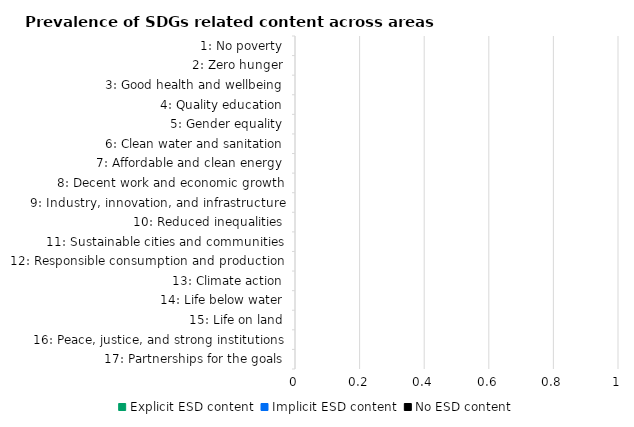
| Category | Explicit ESD content | Implicit ESD content | No ESD content |
|---|---|---|---|
| 17: Partnerships for the goals | 0 | 0 | 0 |
| 16: Peace, justice, and strong institutions | 0 | 0 | 0 |
| 15: Life on land | 0 | 0 | 0 |
| 14: Life below water | 0 | 0 | 0 |
| 13: Climate action | 0 | 0 | 0 |
| 12: Responsible consumption and production | 0 | 0 | 0 |
| 11: Sustainable cities and communities | 0 | 0 | 0 |
| 10: Reduced inequalities | 0 | 0 | 0 |
| 9: Industry, innovation, and infrastructure | 0 | 0 | 0 |
| 8: Decent work and economic growth | 0 | 0 | 0 |
| 7: Affordable and clean energy | 0 | 0 | 0 |
| 6: Clean water and sanitation | 0 | 0 | 0 |
| 5: Gender equality | 0 | 0 | 0 |
| 4: Quality education | 0 | 0 | 0 |
| 3: Good health and wellbeing | 0 | 0 | 0 |
| 2: Zero hunger | 0 | 0 | 0 |
| 1: No poverty | 0 | 0 | 0 |